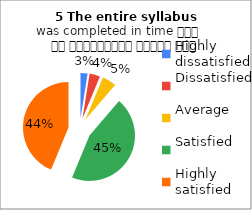
| Category | 5 The entire syllabus
was completed in time समय पर पाठ्यक्रम पूर्ण हुआ |
|---|---|
| Highly dissatisfied | 2 |
| Dissatisfied | 3 |
| Average | 4 |
| Satisfied | 36 |
| Highly satisfied | 35 |